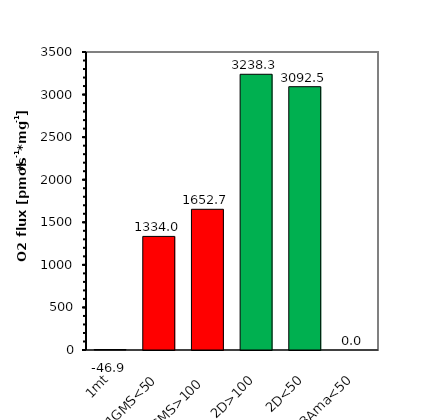
| Category | O2 flux per x (bc) |
|---|---|
| 1mt | -46.929 |
| 1GMS<50 | 1334.026 |
| 1GMS>100 | 1652.672 |
| 2D>100 | 3238.345 |
| 2D<50 | 3092.483 |
| 3Ama<50 | 0 |